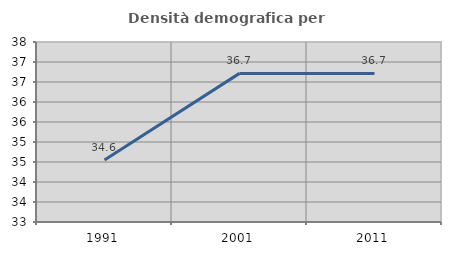
| Category | Densità demografica |
|---|---|
| 1991.0 | 34.552 |
| 2001.0 | 36.716 |
| 2011.0 | 36.716 |